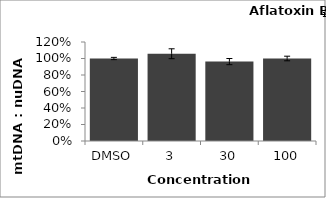
| Category | Series 1 |
|---|---|
| DMSO | 1 |
| 3 | 1.058 |
| 30 | 0.963 |
| 100 | 1 |